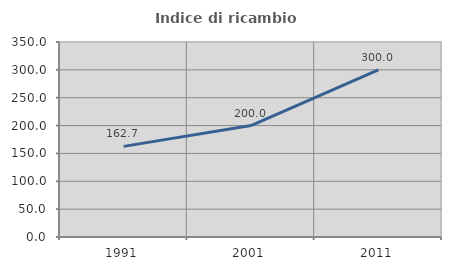
| Category | Indice di ricambio occupazionale  |
|---|---|
| 1991.0 | 162.687 |
| 2001.0 | 200 |
| 2011.0 | 300 |